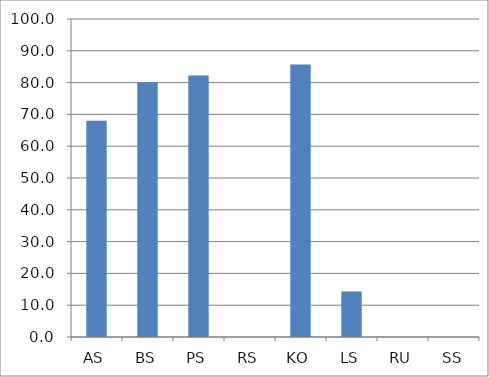
| Category | Series 0 |
|---|---|
| AS | 68 |
| BS | 80 |
| PS | 82.222 |
| RS | 0 |
| KO | 85.714 |
| LS | 14.286 |
| RU | 0 |
| SS | 0 |